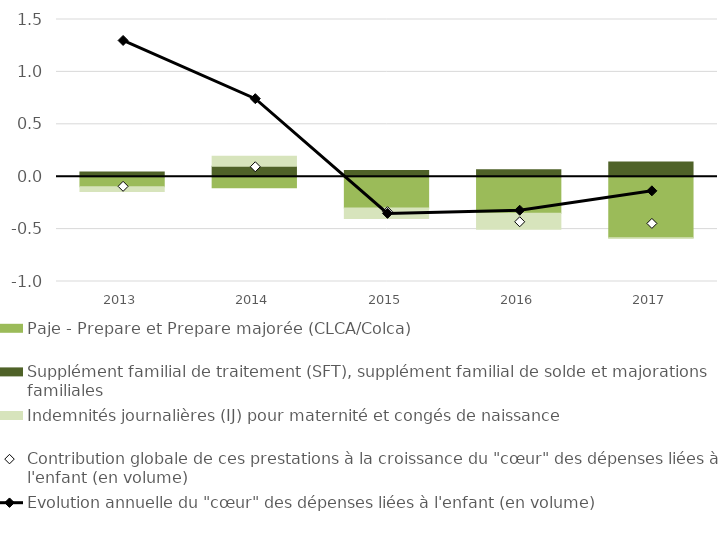
| Category | Paje - Prepare et Prepare majorée (CLCA/Colca) | Supplément familial de traitement (SFT), supplément familial de solde et majorations familiales | Indemnités journalières (IJ) pour maternité et congés de naissance |
|---|---|---|---|
| 2013.0 | -0.097 | 0.045 | -0.045 |
| 2014.0 | -0.106 | 0.1 | 0.096 |
| 2015.0 | -0.299 | 0.06 | -0.1 |
| 2016.0 | -0.348 | 0.067 | -0.154 |
| 2017.0 | -0.582 | 0.139 | -0.008 |